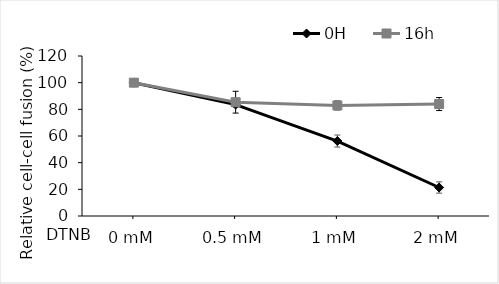
| Category | 0H   | 16h |
|---|---|---|
| 0 mM | 100 | 100 |
| 0.5 mM | 83.552 | 85.36 |
| 1 mM | 56.235 | 82.91 |
| 2 mM | 21.371 | 83.966 |